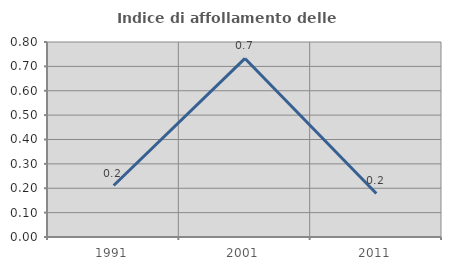
| Category | Indice di affollamento delle abitazioni  |
|---|---|
| 1991.0 | 0.211 |
| 2001.0 | 0.733 |
| 2011.0 | 0.179 |